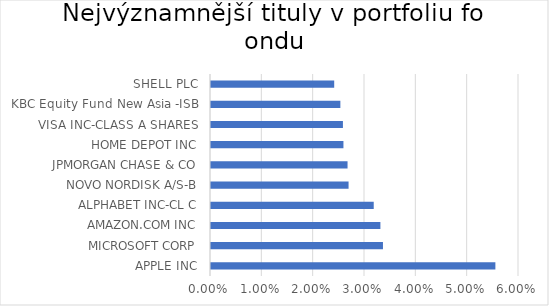
| Category | Series 0 |
|---|---|
| APPLE INC | 0.055 |
| MICROSOFT CORP | 0.034 |
| AMAZON.COM INC | 0.033 |
| ALPHABET INC-CL C | 0.032 |
| NOVO NORDISK A/S-B | 0.027 |
| JPMORGAN CHASE & CO | 0.027 |
| HOME DEPOT INC | 0.026 |
| VISA INC-CLASS A SHARES | 0.026 |
| KBC Equity Fund New Asia -ISB | 0.025 |
| SHELL PLC | 0.024 |